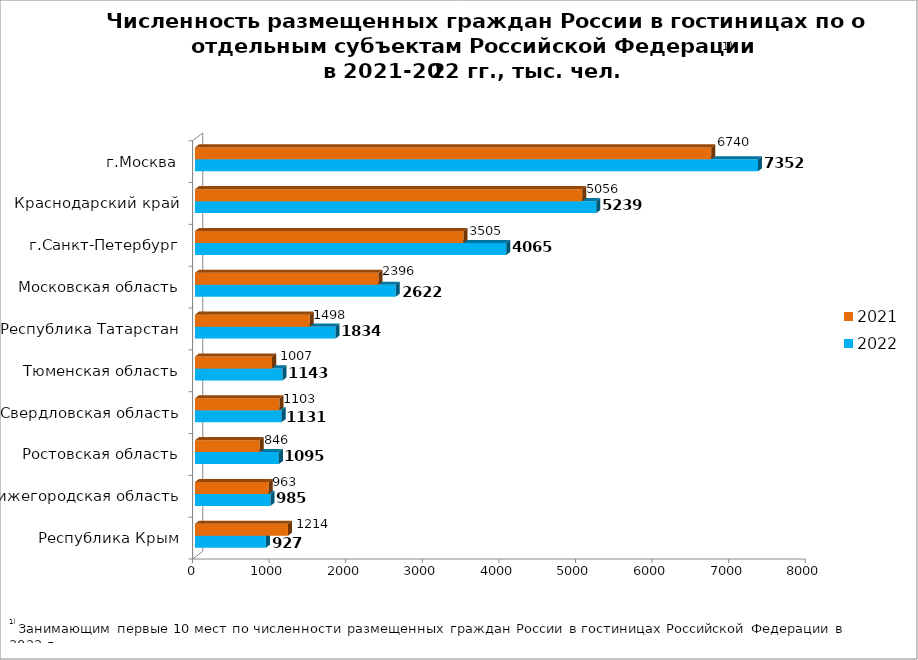
| Category | 2022 | 2021 |
|---|---|---|
| Республика Крым | 926.626 | 1214.201 |
| Нижегородская область | 984.985 | 963.122 |
| Ростовская область | 1095.067 | 845.541 |
| Свердловская область | 1130.892 | 1102.928 |
| Тюменская область | 1143.249 | 1006.539 |
| Республика Татарстан | 1834.451 | 1497.702 |
| Московская область | 2621.563 | 2395.745 |
| г.Санкт-Петербург | 4064.925 | 3505.406 |
| Краснодарский край | 5239.378 | 5056.465 |
| г.Москва | 7352.005 | 6740.436 |